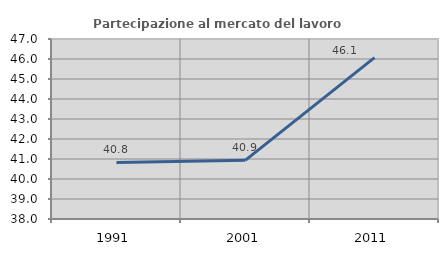
| Category | Partecipazione al mercato del lavoro  femminile |
|---|---|
| 1991.0 | 40.826 |
| 2001.0 | 40.94 |
| 2011.0 | 46.072 |